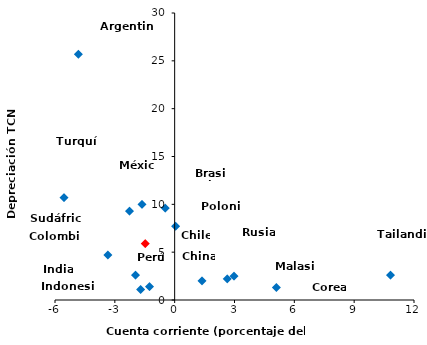
| Category | Series 0 |
|---|---|
| -4.828 | 25.7 |
| -0.475 | 9.6 |
| -1.477 | 5.9 |
| 1.372 | 2 |
| -3.35 | 4.7 |
| -1.639 | 10 |
| -1.262 | 1.4 |
| -1.961 | 2.6 |
| -1.703 | 1.1 |
| 2.979 | 2.5 |
| 5.101 | 1.3 |
| 10.821 | 2.6 |
| 0.047 | 7.7 |
| 2.635 | 2.2 |
| -2.265 | 9.3 |
| -5.545 | 10.7 |